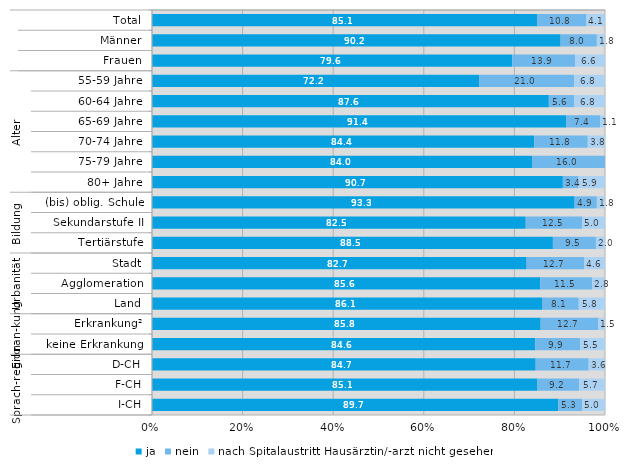
| Category | ja | nein | nach Spitalaustritt Hausärztin/-arzt nicht gesehen |
|---|---|---|---|
| 0 | 85.1 | 10.8 | 4.1 |
| 1 | 90.2 | 8 | 1.8 |
| 2 | 79.6 | 13.9 | 6.6 |
| 3 | 72.2 | 21 | 6.8 |
| 4 | 87.6 | 5.6 | 6.8 |
| 5 | 91.4 | 7.4 | 1.1 |
| 6 | 84.4 | 11.8 | 3.8 |
| 7 | 84 | 16 | 0 |
| 8 | 90.7 | 3.4 | 5.9 |
| 9 | 93.3 | 4.9 | 1.8 |
| 10 | 82.5 | 12.5 | 5 |
| 11 | 88.5 | 9.5 | 2 |
| 12 | 82.7 | 12.7 | 4.6 |
| 13 | 85.6 | 11.5 | 2.8 |
| 14 | 86.1 | 8.1 | 5.8 |
| 15 | 85.8 | 12.7 | 1.5 |
| 16 | 84.6 | 9.9 | 5.5 |
| 17 | 84.7 | 11.7 | 3.6 |
| 18 | 85.1 | 9.2 | 5.7 |
| 19 | 89.7 | 5.3 | 5 |